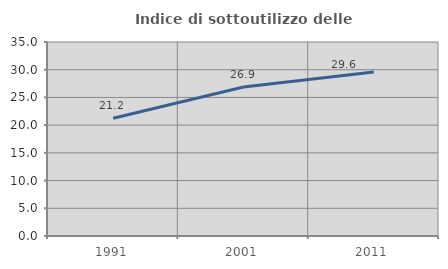
| Category | Indice di sottoutilizzo delle abitazioni  |
|---|---|
| 1991.0 | 21.234 |
| 2001.0 | 26.883 |
| 2011.0 | 29.593 |